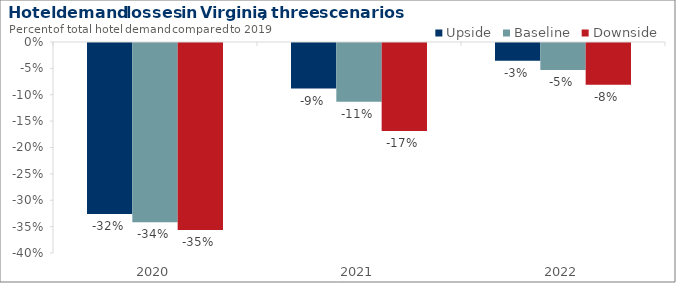
| Category | Upside | Baseline | Downside |
|---|---|---|---|
| 2020.0 | -0.324 | -0.34 | -0.354 |
| 2021.0 | -0.086 | -0.111 | -0.167 |
| 2022.0 | -0.033 | -0.051 | -0.079 |